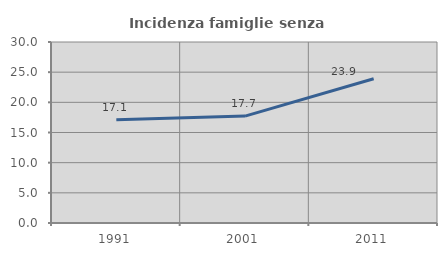
| Category | Incidenza famiglie senza nuclei |
|---|---|
| 1991.0 | 17.099 |
| 2001.0 | 17.717 |
| 2011.0 | 23.909 |